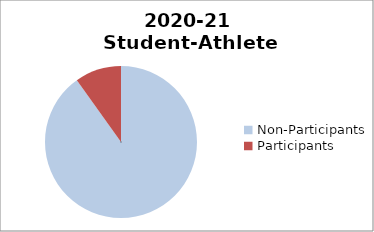
| Category | 2015-16 Student-Athlete Participation (Male) |
|---|---|
| Non-Participants | 804 |
| Participants | 88 |